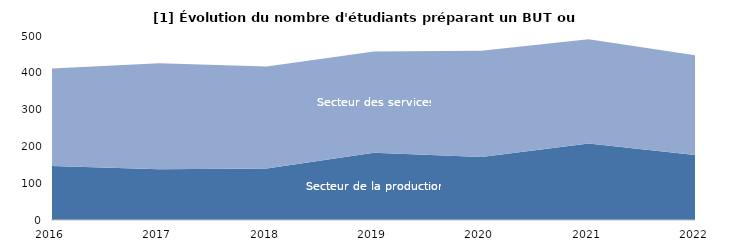
| Category | Secteur de la production | Secteur des services |
|---|---|---|
| 2016.0 | 147 | 265 |
| 2017.0 | 138 | 288 |
| 2018.0 | 140 | 277 |
| 2019.0 | 183 | 275 |
| 2020.0 | 171 | 289 |
| 2021.0 | 208 | 283 |
| 2022.0 | 176 | 271 |